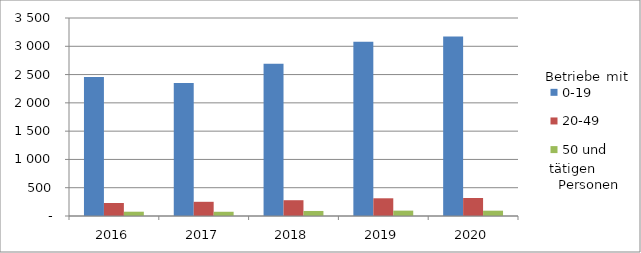
| Category | 0-19 | 20-49 | 50 und mehr |
|---|---|---|---|
| 2016.0 | 2456 | 230 | 76 |
| 2017.0 | 2350 | 251 | 75 |
| 2018.0 | 2691 | 279 | 89 |
| 2019.0 | 3080 | 313 | 95 |
| 2020.0 | 3171 | 318 | 94 |